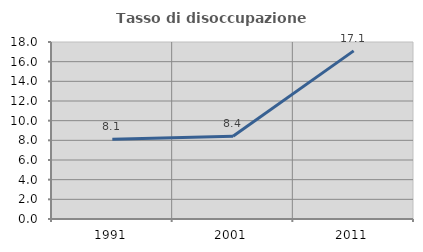
| Category | Tasso di disoccupazione giovanile  |
|---|---|
| 1991.0 | 8.121 |
| 2001.0 | 8.418 |
| 2011.0 | 17.098 |